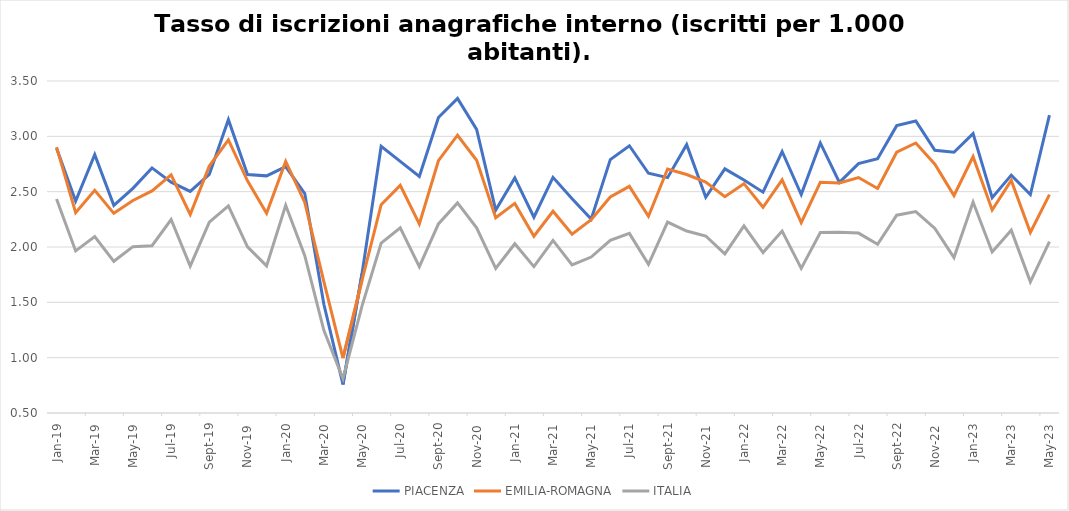
| Category | PIACENZA | EMILIA-ROMAGNA | ITALIA |
|---|---|---|---|
| 2019-01-01 | 2.893 | 2.902 | 2.434 |
| 2019-02-01 | 2.415 | 2.309 | 1.965 |
| 2019-03-01 | 2.834 | 2.513 | 2.094 |
| 2019-04-01 | 2.376 | 2.304 | 1.871 |
| 2019-05-01 | 2.53 | 2.42 | 2.003 |
| 2019-06-01 | 2.715 | 2.506 | 2.012 |
| 2019-07-01 | 2.586 | 2.651 | 2.248 |
| 2019-08-01 | 2.502 | 2.294 | 1.828 |
| 2019-09-01 | 2.655 | 2.731 | 2.225 |
| 2019-10-01 | 3.151 | 2.968 | 2.372 |
| 2019-11-01 | 2.654 | 2.598 | 2.002 |
| 2019-12-01 | 2.643 | 2.304 | 1.829 |
| 2020-01-01 | 2.727 | 2.774 | 2.377 |
| 2020-02-01 | 2.483 | 2.403 | 1.921 |
| 2020-03-01 | 1.483 | 1.687 | 1.248 |
| 2020-04-01 | 0.758 | 0.995 | 0.81 |
| 2020-05-01 | 1.76 | 1.701 | 1.468 |
| 2020-06-01 | 2.91 | 2.383 | 2.036 |
| 2020-07-01 | 2.773 | 2.557 | 2.173 |
| 2020-08-01 | 2.637 | 2.209 | 1.822 |
| 2020-09-01 | 3.171 | 2.78 | 2.209 |
| 2020-10-01 | 3.343 | 3.01 | 2.398 |
| 2020-11-01 | 3.062 | 2.784 | 2.173 |
| 2020-12-01 | 2.333 | 2.264 | 1.807 |
| 2021-01-01 | 2.624 | 2.394 | 2.03 |
| 2021-02-01 | 2.269 | 2.097 | 1.823 |
| 2021-03-01 | 2.629 | 2.323 | 2.06 |
| 2021-04-01 | 2.436 | 2.115 | 1.839 |
| 2021-05-01 | 2.252 | 2.246 | 1.909 |
| 2021-06-01 | 2.789 | 2.452 | 2.06 |
| 2021-07-01 | 2.915 | 2.548 | 2.123 |
| 2021-08-01 | 2.666 | 2.278 | 1.843 |
| 2021-09-01 | 2.627 | 2.705 | 2.225 |
| 2021-10-01 | 2.925 | 2.655 | 2.144 |
| 2021-11-01 | 2.45 | 2.588 | 2.099 |
| 2021-12-01 | 2.706 | 2.455 | 1.937 |
| 2022-01-01 | 2.605 | 2.572 | 2.19 |
| 2022-02-01 | 2.496 | 2.359 | 1.95 |
| 2022-03-01 | 2.863 | 2.607 | 2.144 |
| 2022-04-01 | 2.474 | 2.221 | 1.807 |
| 2022-05-01 | 2.94 | 2.584 | 2.132 |
| 2022-06-01 | 2.583 | 2.579 | 2.134 |
| 2022-07-01 | 2.753 | 2.627 | 2.126 |
| 2022-08-01 | 2.798 | 2.529 | 2.024 |
| 2022-09-01 | 3.097 | 2.856 | 2.288 |
| 2022-10-01 | 3.138 | 2.94 | 2.32 |
| 2022-11-01 | 2.873 | 2.748 | 2.168 |
| 2022-12-01 | 2.856 | 2.465 | 1.905 |
| 2023-01-01 | 3.025 | 2.816 | 2.406 |
| 2023-02-01 | 2.445 | 2.335 | 1.955 |
| 2023-03-01 | 2.649 | 2.602 | 2.152 |
| 2023-04-01 | 2.473 | 2.131 | 1.685 |
| 2023-05-01 | 3.192 | 2.473 | 2.048 |